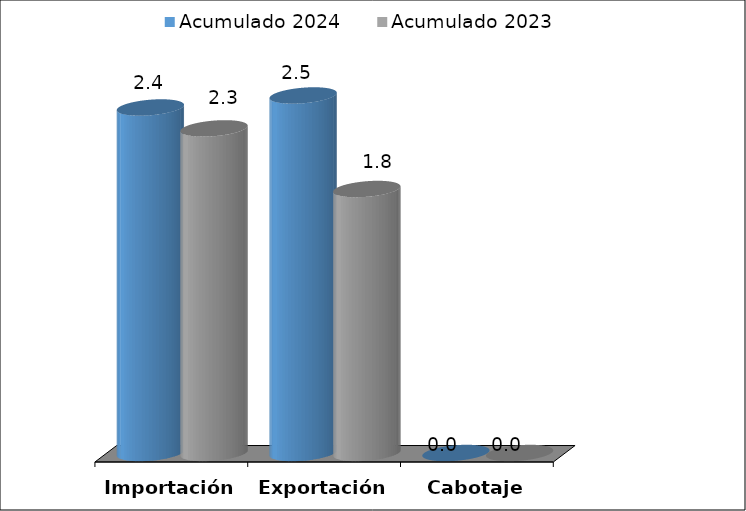
| Category | Acumulado 2024 | Acumulado 2023 |
|---|---|---|
| Importación | 2.416 | 2.27 |
| Exportación | 2.5 | 1.846 |
| Cabotaje | 0 | 0 |